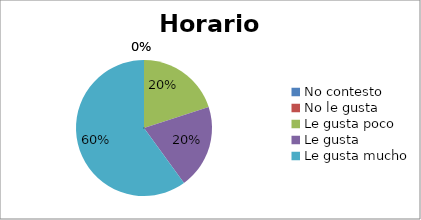
| Category | Series 0 |
|---|---|
| No contesto | 0 |
| No le gusta | 0 |
| Le gusta poco | 1 |
| Le gusta | 1 |
| Le gusta mucho | 3 |